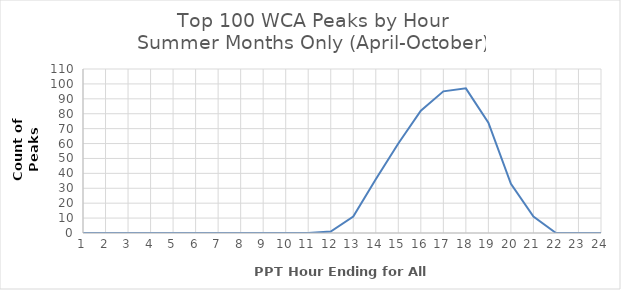
| Category | Total |
|---|---|
| 1.0 | 0 |
| 2.0 | 0 |
| 3.0 | 0 |
| 4.0 | 0 |
| 5.0 | 0 |
| 6.0 | 0 |
| 7.0 | 0 |
| 8.0 | 0 |
| 9.0 | 0 |
| 10.0 | 0 |
| 11.0 | 0 |
| 12.0 | 1 |
| 13.0 | 11 |
| 14.0 | 36 |
| 15.0 | 60 |
| 16.0 | 82 |
| 17.0 | 95 |
| 18.0 | 97 |
| 19.0 | 74 |
| 20.0 | 33 |
| 21.0 | 11 |
| 22.0 | 0 |
| 23.0 | 0 |
| 24.0 | 0 |